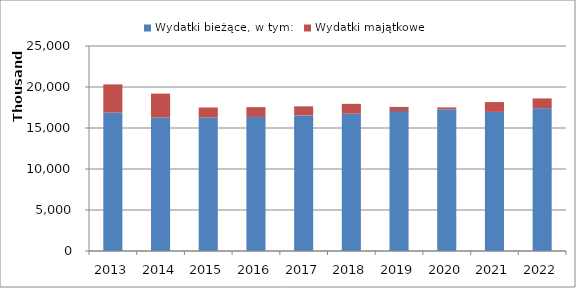
| Category | Wydatki bieżące, w tym: | Wydatki majątkowe |
|---|---|---|
| 2013.0 | 16881117.5 | 3439772.25 |
| 2014.0 | 16272983 | 2920361 |
| 2015.0 | 16273673 | 1226327 |
| 2016.0 | 16346533 | 1197417 |
| 2017.0 | 16533929 | 1103340 |
| 2018.0 | 16741237 | 1204150 |
| 2019.0 | 17061844 | 506904 |
| 2020.0 | 17260149 | 247662 |
| 2021.0 | 16966564 | 1196481 |
| 2022.0 | 17393510 | 1211426 |